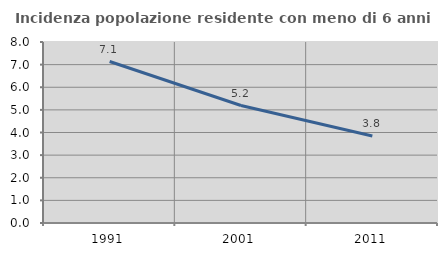
| Category | Incidenza popolazione residente con meno di 6 anni |
|---|---|
| 1991.0 | 7.136 |
| 2001.0 | 5.192 |
| 2011.0 | 3.842 |